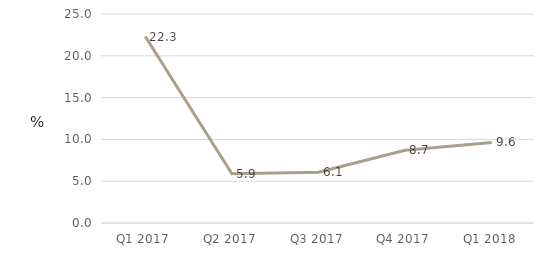
| Category | Non-Financial  |
|---|---|
| Q1 2017 | 22.305 |
| Q2 2017 | 5.881 |
| Q3 2017 | 6.074 |
| Q4 2017 | 8.707 |
| Q1 2018 | 9.639 |